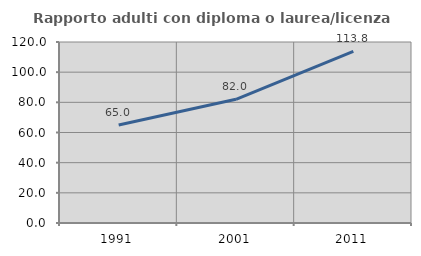
| Category | Rapporto adulti con diploma o laurea/licenza media  |
|---|---|
| 1991.0 | 64.952 |
| 2001.0 | 81.995 |
| 2011.0 | 113.839 |